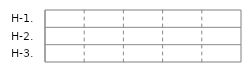
| Category | IN | OUT |
|---|---|---|
| H-1. | 0 | 0 |
| H-2. | 0 | 0 |
| H-3. | 0 | 0 |